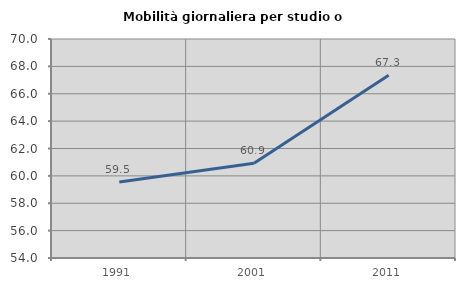
| Category | Mobilità giornaliera per studio o lavoro |
|---|---|
| 1991.0 | 59.547 |
| 2001.0 | 60.923 |
| 2011.0 | 67.345 |